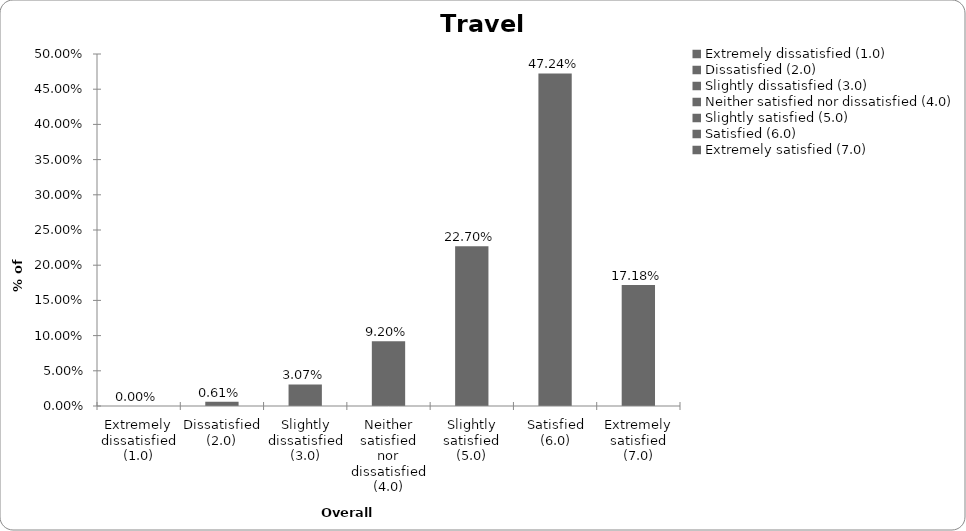
| Category | Series 0 |
|---|---|
| Extremely dissatisfied (1.0) | 0 |
| Dissatisfied (2.0) | 0.006 |
| Slightly dissatisfied (3.0) | 0.031 |
| Neither satisfied nor dissatisfied (4.0) | 0.092 |
| Slightly satisfied (5.0) | 0.227 |
| Satisfied (6.0) | 0.472 |
| Extremely satisfied (7.0) | 0.172 |